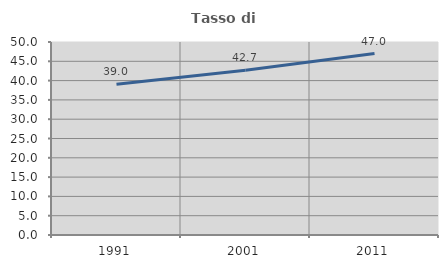
| Category | Tasso di occupazione   |
|---|---|
| 1991.0 | 39.041 |
| 2001.0 | 42.653 |
| 2011.0 | 47.004 |